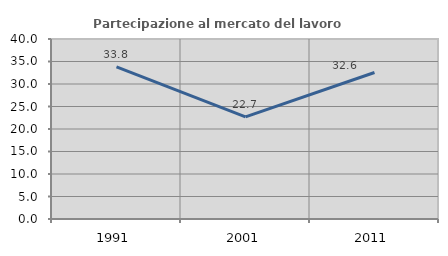
| Category | Partecipazione al mercato del lavoro  femminile |
|---|---|
| 1991.0 | 33.79 |
| 2001.0 | 22.687 |
| 2011.0 | 32.562 |